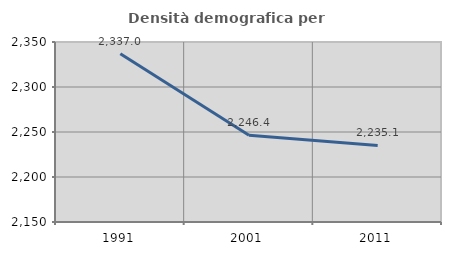
| Category | Densità demografica |
|---|---|
| 1991.0 | 2336.974 |
| 2001.0 | 2246.386 |
| 2011.0 | 2235.104 |